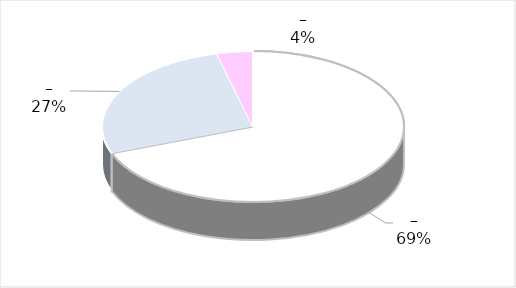
| Category | Series 0 |
|---|---|
| 0 | 36 |
| 1 | 14 |
| 2 | 2 |